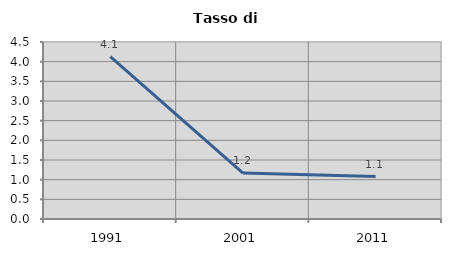
| Category | Tasso di disoccupazione   |
|---|---|
| 1991.0 | 4.129 |
| 2001.0 | 1.167 |
| 2011.0 | 1.079 |